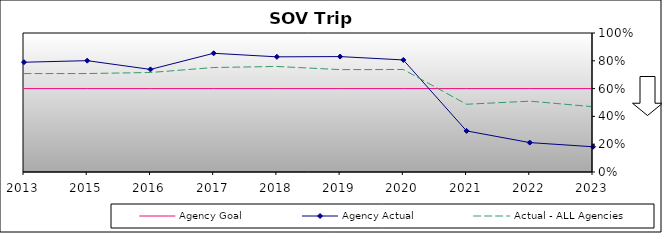
| Category | Agency Goal | Agency Actual | Actual - ALL Agencies |
|---|---|---|---|
| 2013.0 | 0.6 | 0.79 | 0.708 |
| 2015.0 | 0.6 | 0.801 | 0.708 |
| 2016.0 | 0.6 | 0.738 | 0.716 |
| 2017.0 | 0.6 | 0.854 | 0.752 |
| 2018.0 | 0.6 | 0.828 | 0.759 |
| 2019.0 | 0.6 | 0.83 | 0.736 |
| 2020.0 | 0.6 | 0.806 | 0.737 |
| 2021.0 | 0.6 | 0.296 | 0.487 |
| 2022.0 | 0.6 | 0.212 | 0.509 |
| 2023.0 | 0.6 | 0.182 | 0.47 |